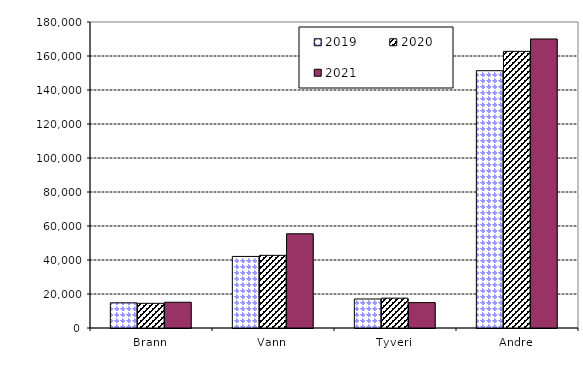
| Category | 2019 | 2020 | 2021 |
|---|---|---|---|
| Brann | 14807.767 | 14515.715 | 15152.745 |
| Vann | 42098.168 | 42736.006 | 55420.008 |
| Tyveri | 17067.714 | 17552.031 | 14942.034 |
| Andre | 151351.72 | 162737.467 | 170017.659 |